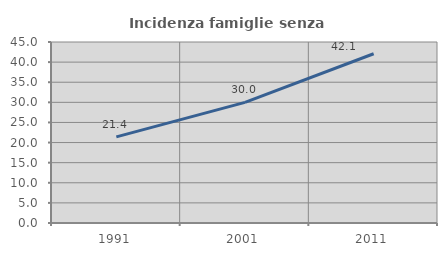
| Category | Incidenza famiglie senza nuclei |
|---|---|
| 1991.0 | 21.405 |
| 2001.0 | 29.988 |
| 2011.0 | 42.083 |